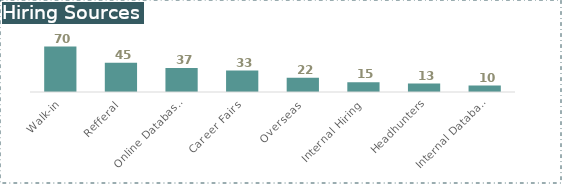
| Category | # hire |
|---|---|
| Walk-in | 70 |
| Refferal | 45 |
| Online Databases | 37 |
| Career Fairs | 33 |
| Overseas | 22 |
| Internal Hiring | 15 |
| Headhunters | 13 |
| Internal Databases | 10 |